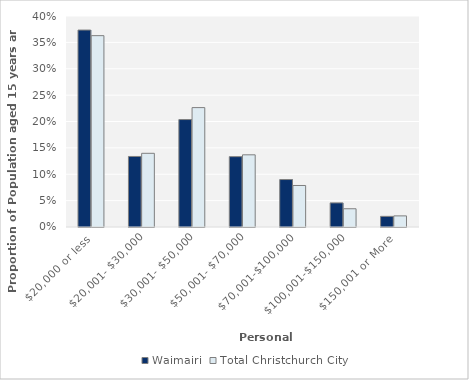
| Category | Waimairi | Total Christchurch City |
|---|---|---|
| $20,000 or less | 0.373 | 0.363 |
| $20,001- $30,000 | 0.134 | 0.14 |
| $30,001- $50,000 | 0.204 | 0.226 |
| $50,001- $70,000 | 0.133 | 0.137 |
| $70,001-$100,000 | 0.09 | 0.079 |
| $100,001-$150,000 | 0.046 | 0.035 |
| $150,001 or More | 0.02 | 0.021 |